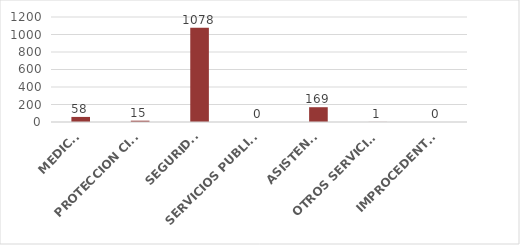
| Category | TOTAL |
|---|---|
| MEDICO | 58 |
| PROTECCION CIVIL | 15 |
| SEGURIDAD | 1078 |
| SERVICIOS PUBLICOS | 0 |
| ASISTENCIA | 169 |
| OTROS SERVICIOS | 1 |
| IMPROCEDENTES | 0 |